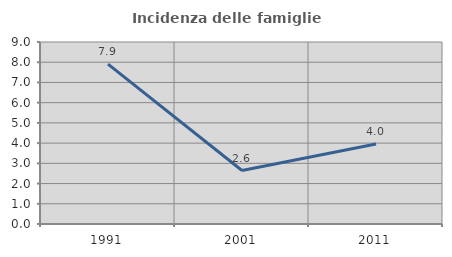
| Category | Incidenza delle famiglie numerose |
|---|---|
| 1991.0 | 7.908 |
| 2001.0 | 2.643 |
| 2011.0 | 3.953 |